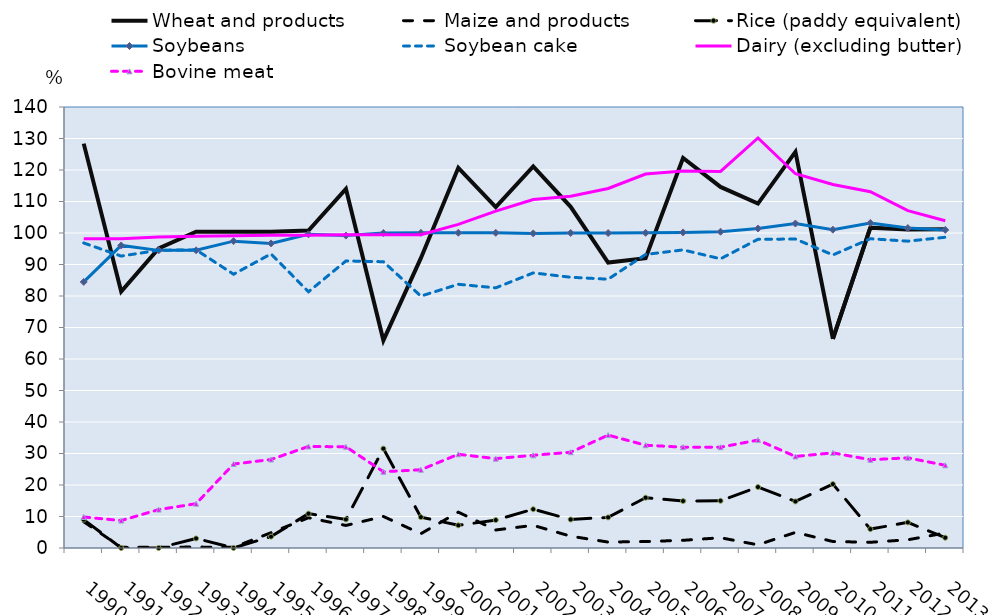
| Category | Wheat and products | Maize and products | Rice (paddy equivalent) | Soybeans | Soybean cake | Dairy (excluding butter) | Bovine meat |
|---|---|---|---|---|---|---|---|
| 1990.0 | 128.371 | 8.341 | 9.014 | 84.461 | 96.83 | 98.153 | 9.844 |
| 1991.0 | 81.445 | 0.22 | 0.002 | 96.05 | 92.671 | 98.187 | 8.704 |
| 1992.0 | 95.078 | 0.245 | 0.01 | 94.486 | 94.525 | 98.721 | 12.194 |
| 1993.0 | 100.401 | 0.292 | 3.032 | 94.5 | 94.655 | 98.981 | 14.063 |
| 1994.0 | 100.36 | 0.215 | 0.023 | 97.417 | 86.908 | 99.159 | 26.647 |
| 1995.0 | 100.36 | 4.857 | 3.614 | 96.69 | 93.371 | 99.262 | 28.096 |
| 1996.0 | 100.79 | 9.604 | 10.915 | 99.589 | 81.335 | 99.323 | 32.235 |
| 1997.0 | 114.029 | 7.163 | 9.08 | 99.175 | 91.129 | 99.428 | 32.132 |
| 1998.0 | 65.928 | 10.013 | 31.549 | 100.004 | 90.883 | 99.433 | 24.207 |
| 1999.0 | 92.003 | 4.537 | 9.805 | 100.053 | 79.969 | 99.435 | 24.846 |
| 2000.0 | 120.694 | 11.375 | 7.202 | 100.075 | 83.715 | 102.728 | 29.75 |
| 2001.0 | 108.219 | 5.72 | 8.873 | 100.058 | 82.591 | 106.955 | 28.372 |
| 2002.0 | 121.116 | 7.196 | 12.309 | 99.873 | 87.341 | 110.631 | 29.439 |
| 2003.0 | 108.318 | 3.744 | 9.054 | 100.018 | 85.953 | 111.667 | 30.405 |
| 2004.0 | 90.635 | 1.882 | 9.72 | 99.969 | 85.333 | 114.132 | 35.839 |
| 2005.0 | 92.001 | 2.047 | 15.965 | 100.053 | 93.187 | 118.736 | 32.624 |
| 2006.0 | 123.822 | 2.442 | 14.908 | 100.181 | 94.636 | 119.653 | 32.01 |
| 2007.0 | 114.63 | 3.252 | 14.997 | 100.399 | 91.809 | 119.563 | 32.001 |
| 2008.0 | 109.331 | 1.008 | 19.35 | 101.419 | 98.002 | 130.175 | 34.268 |
| 2009.0 | 125.76 | 4.961 | 14.783 | 103.01 | 98.086 | 118.813 | 29.064 |
| 2010.0 | 66.369 | 2.059 | 20.301 | 101.053 | 93.032 | 115.393 | 30.202 |
| 2011.0 | 101.69 | 1.814 | 6.003 | 103.191 | 98.18 | 113.1 | 28.025 |
| 2012.0 | 101.073 | 2.61 | 8.132 | 101.573 | 97.406 | 107.093 | 28.623 |
| 2013.0 | 101.227 | 4.768 | 3.263 | 100.987 | 98.649 | 103.903 | 26.255 |